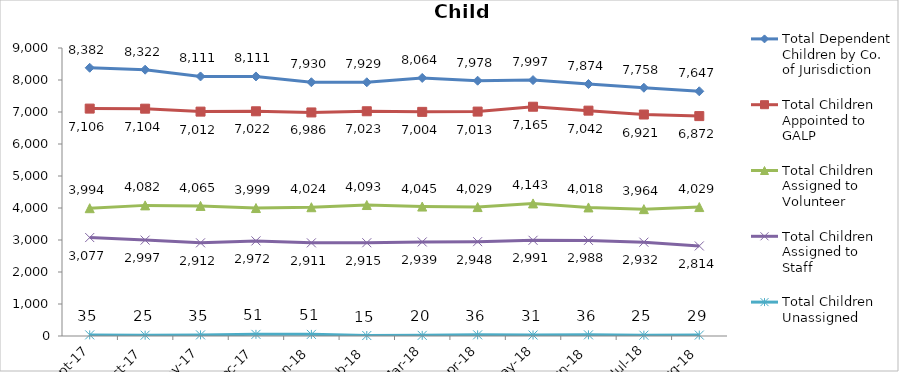
| Category | Total Dependent Children by Co. of Jurisdiction | Total Children Appointed to GALP | Total Children Assigned to Volunteer | Total Children Assigned to Staff | Total Children Unassigned |
|---|---|---|---|---|---|
| 2017-09-01 | 8382 | 7106 | 3994 | 3077 | 35 |
| 2017-10-01 | 8322 | 7104 | 4082 | 2997 | 25 |
| 2017-11-01 | 8111 | 7012 | 4065 | 2912 | 35 |
| 2017-12-01 | 8111 | 7022 | 3999 | 2972 | 51 |
| 2018-01-01 | 7930 | 6986 | 4024 | 2911 | 51 |
| 2018-02-01 | 7929 | 7023 | 4093 | 2915 | 15 |
| 2018-03-01 | 8064 | 7004 | 4045 | 2939 | 20 |
| 2018-04-01 | 7978 | 7013 | 4029 | 2948 | 36 |
| 2018-05-01 | 7997 | 7165 | 4143 | 2991 | 31 |
| 2018-06-01 | 7874 | 7042 | 4018 | 2988 | 36 |
| 2018-07-01 | 7758 | 6921 | 3964 | 2932 | 25 |
| 2018-08-01 | 7647 | 6872 | 4029 | 2814 | 29 |